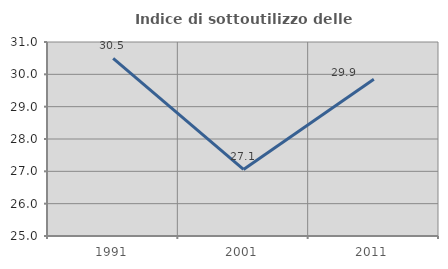
| Category | Indice di sottoutilizzo delle abitazioni  |
|---|---|
| 1991.0 | 30.496 |
| 2001.0 | 27.059 |
| 2011.0 | 29.851 |